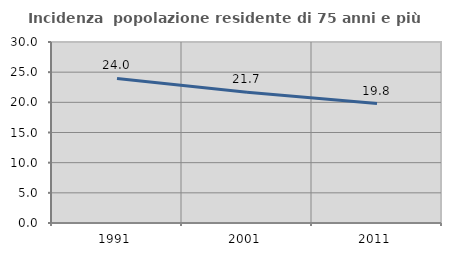
| Category | Incidenza  popolazione residente di 75 anni e più |
|---|---|
| 1991.0 | 23.954 |
| 2001.0 | 21.667 |
| 2011.0 | 19.8 |